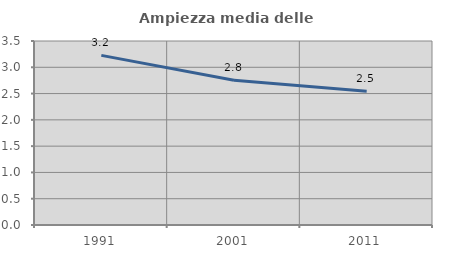
| Category | Ampiezza media delle famiglie |
|---|---|
| 1991.0 | 3.226 |
| 2001.0 | 2.754 |
| 2011.0 | 2.542 |